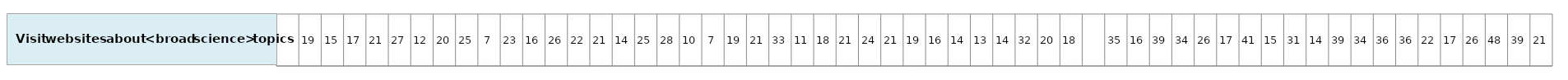
| Category | Visit web sites about <broad science> topics |
|---|---|
| nan | 1 |
| 18.82471079532585 | 1 |
| 14.91384815141769 | 1 |
| 16.5242619394377 | 1 |
| 21.11394290106691 | 1 |
| 27.32644317938424 | 1 |
| 12.14998372679199 | 1 |
| 19.50429570165406 | 1 |
| 25.40089125169455 | 1 |
| 7.09014661322097 | 1 |
| 22.75583474473039 | 1 |
| 15.64524518316569 | 1 |
| 26.2873437487035 | 1 |
| 21.88544546989278 | 1 |
| 20.81255043958765 | 1 |
| 14.41756158561882 | 1 |
| 25.43077946627249 | 1 |
| 27.67960590126043 | 1 |
| 10.10978060015955 | 1 |
| 6.60179530853118 | 1 |
| 19.05478068813014 | 1 |
| 21.29123260231843 | 1 |
| 32.85879426344442 | 1 |
| 11.35227712145465 | 1 |
| 17.90297343008935 | 1 |
| 20.95460685598098 | 1 |
| 23.61153951529222 | 1 |
| 21.14048986339799 | 1 |
| 19.34958591320488 | 1 |
| 15.55423202488439 | 1 |
| 14.48687890334205 | 1 |
| 13.20990856081511 | 1 |
| 14.44970045211644 | 1 |
| 31.83961954032479 | 1 |
| 20.47019809751001 | 1 |
| 17.98538982602769 | 1 |
| nan | 1 |
| 34.7909903879361 | 1 |
| 16.36597229189559 | 1 |
| 39.14059405567745 | 1 |
| 34.39750505383506 | 1 |
| 25.88518915346097 | 1 |
| 17.00995834052216 | 1 |
| 40.74409872545417 | 1 |
| 15.29115751608211 | 1 |
| 30.95775210140259 | 1 |
| 14.25277976938029 | 1 |
| 38.52917446624554 | 1 |
| 34.42623046100738 | 1 |
| 36.04838433510432 | 1 |
| 36.24022480650714 | 1 |
| 22.1876695761326 | 1 |
| 16.68605003349132 | 1 |
| 26.39087511832425 | 1 |
| 47.66649840644887 | 1 |
| 39.20243565683607 | 1 |
| 21.46646852872643 | 1 |